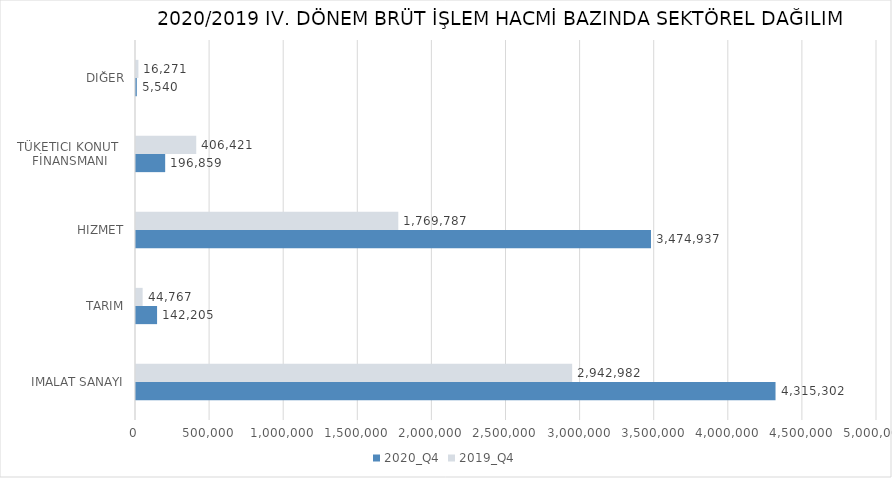
| Category | 2020_Q4 | 2019_Q4 |
|---|---|---|
| İMALAT SANAYİ | 4315302.094 | 2942981.64 |
| TARIM | 142205.005 | 44766.558 |
| HİZMET | 3474937.115 | 1769787.048 |
| TÜKETİCİ KONUT 
FİNANSMANI | 196859 | 406421 |
| DİĞER | 5540 | 16271 |